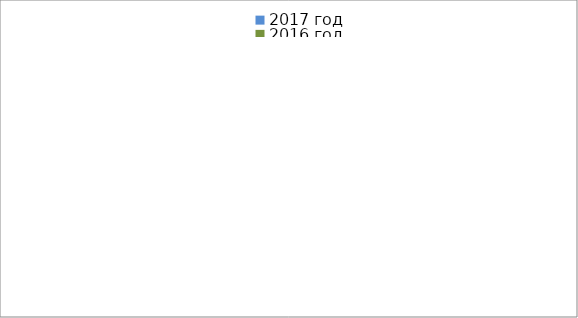
| Category | 2017 год | 2016 год |
|---|---|---|
|  - поджог | 14 | 36 |
|  - неосторожное обращение с огнём | 7 | 22 |
|  - НПТЭ электрооборудования | 17 | 18 |
|  - НПУ и Э печей | 42 | 31 |
|  - НПУ и Э транспортных средств | 44 | 26 |
|   -Шалость с огнем детей | 3 | 6 |
|  -НППБ при эксплуатации эл.приборов | 24 | 9 |
|  - курение | 32 | 16 |
| - прочие | 72 | 78 |
| - не установленные причины | 0 | 12 |